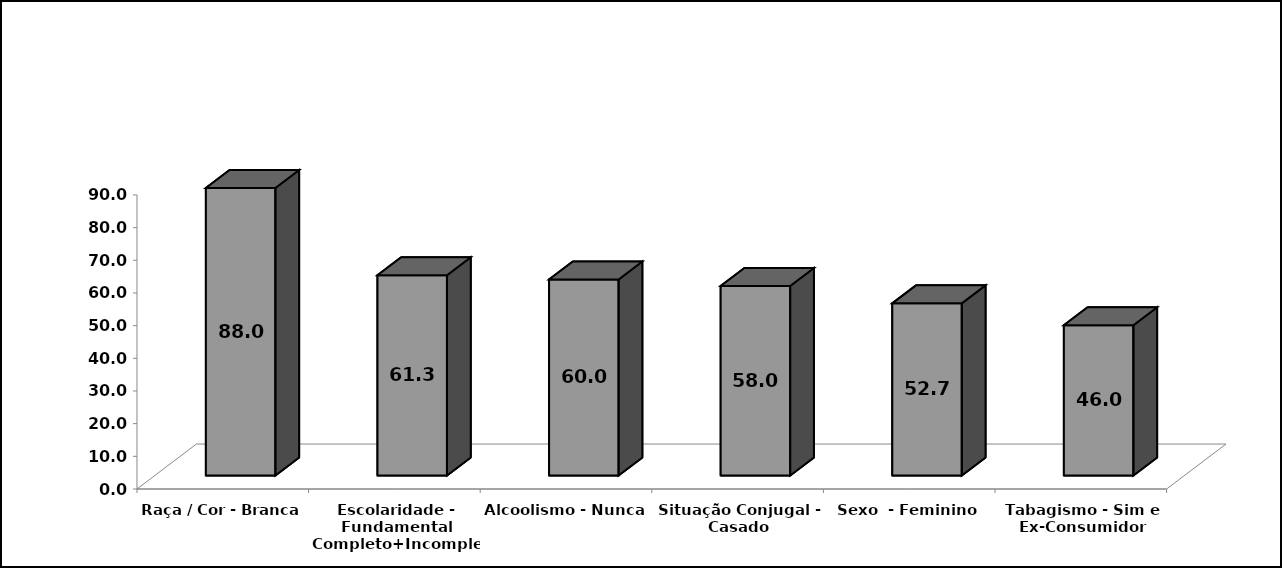
| Category | Series 0 |
|---|---|
| Raça / Cor - Branca | 88 |
| Escolaridade - Fundamental Completo+Incompleto | 61.3 |
| Alcoolismo - Nunca | 60 |
| Situação Conjugal - Casado | 58 |
| Sexo  - Feminino | 52.7 |
| Tabagismo - Sim e Ex-Consumidor | 46 |